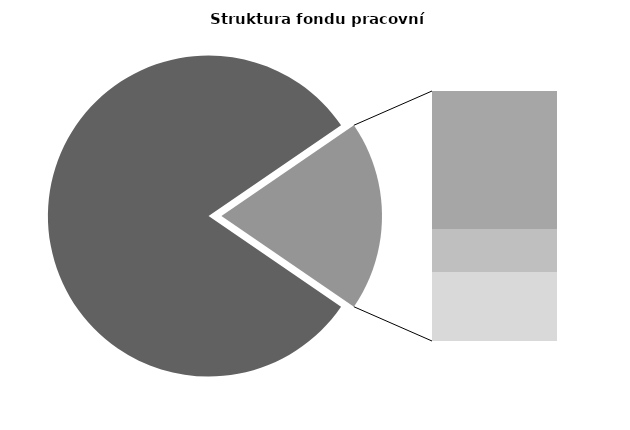
| Category | Series 0 |
|---|---|
| Průměrná měsíční odpracovaná doba bez přesčasu | 139.268 |
| Dovolená | 18.161 |
| Nemoc | 5.681 |
| Jiné | 9.073 |